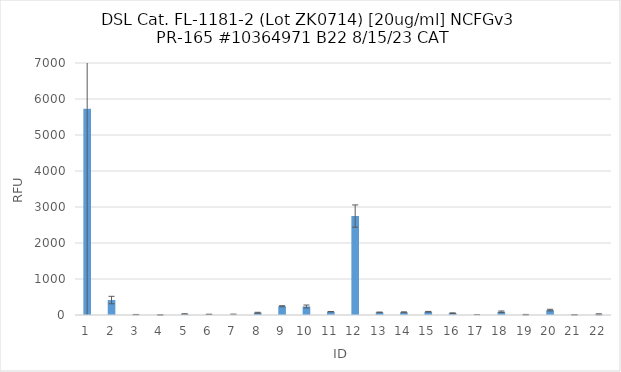
| Category | RFU |
|---|---|
| 0 | 5732 |
| 1 | 415.25 |
| 2 | 11 |
| 3 | 2.25 |
| 4 | 28 |
| 5 | 18.25 |
| 6 | 10.25 |
| 7 | 62.75 |
| 8 | 243 |
| 9 | 236.75 |
| 10 | 91.5 |
| 11 | 2748 |
| 12 | 73 |
| 13 | 75.75 |
| 14 | 89.5 |
| 15 | 51.75 |
| 16 | 2.25 |
| 17 | 91 |
| 18 | 9 |
| 19 | 136.5 |
| 20 | 5.5 |
| 21 | 18 |